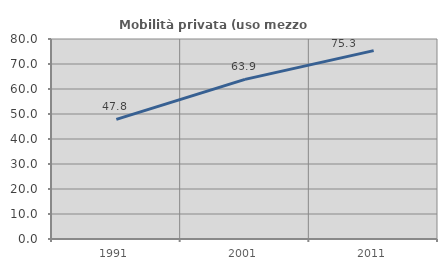
| Category | Mobilità privata (uso mezzo privato) |
|---|---|
| 1991.0 | 47.846 |
| 2001.0 | 63.863 |
| 2011.0 | 75.341 |